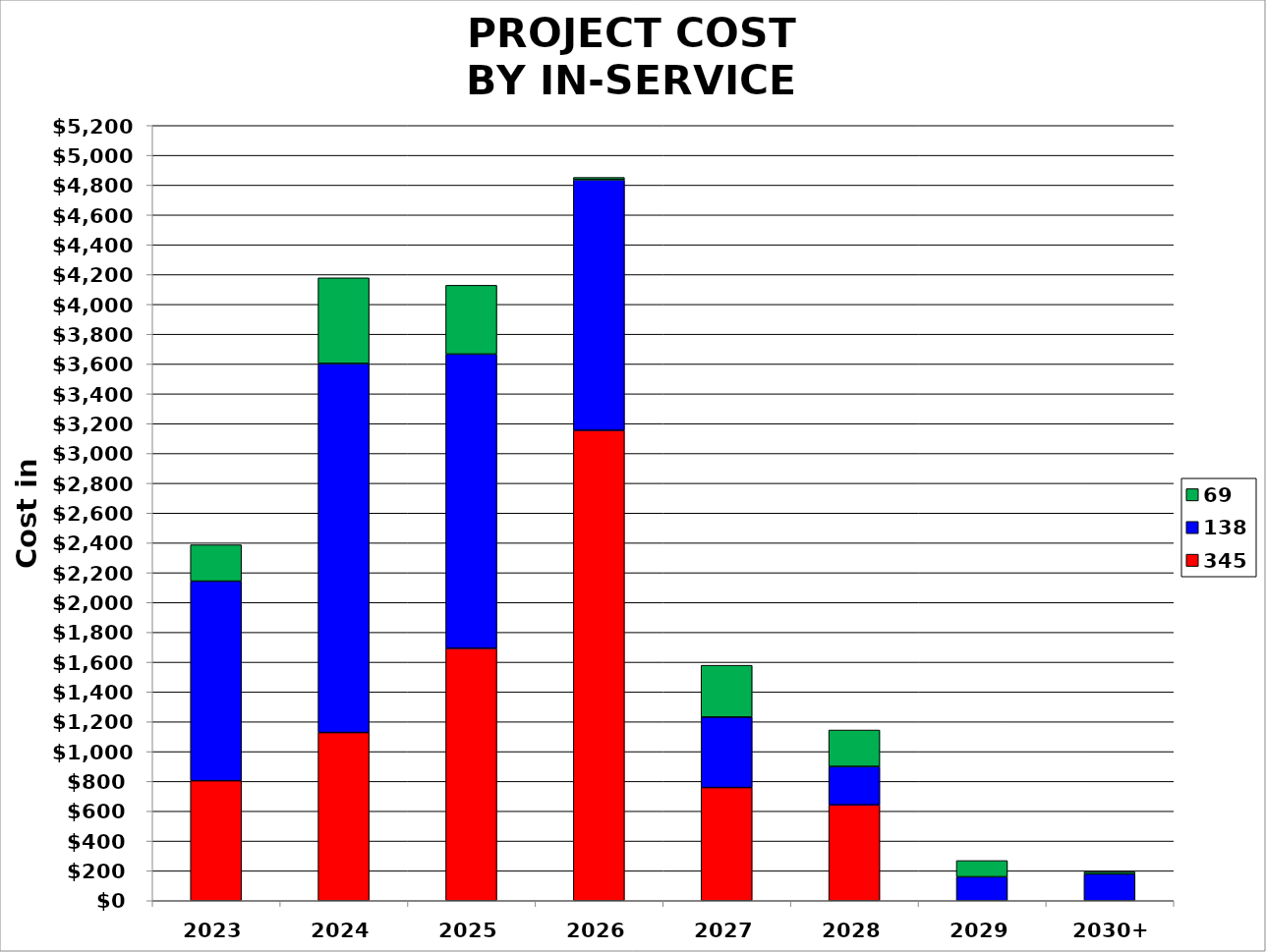
| Category | 345 | 138 | 69 |
|---|---|---|---|
| 2023 | 804773000 | 1338626414 | 243978000 |
| 2024 | 1127962000 | 2475754052 | 574437577.09 |
| 2025 | 1692900000 | 1973844674 | 461542000 |
| 2026 | 3155310638 | 1681314000 | 15000000 |
| 2027 | 758996000 | 472658000 | 347609000 |
| 2028 | 643120000 | 257474000 | 244337000 |
| 2029 | 0 | 160255000 | 108853000 |
| 2030+ | 0 | 179460000 | 13633000 |